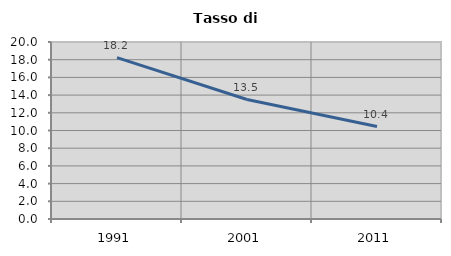
| Category | Tasso di disoccupazione   |
|---|---|
| 1991.0 | 18.235 |
| 2001.0 | 13.501 |
| 2011.0 | 10.442 |